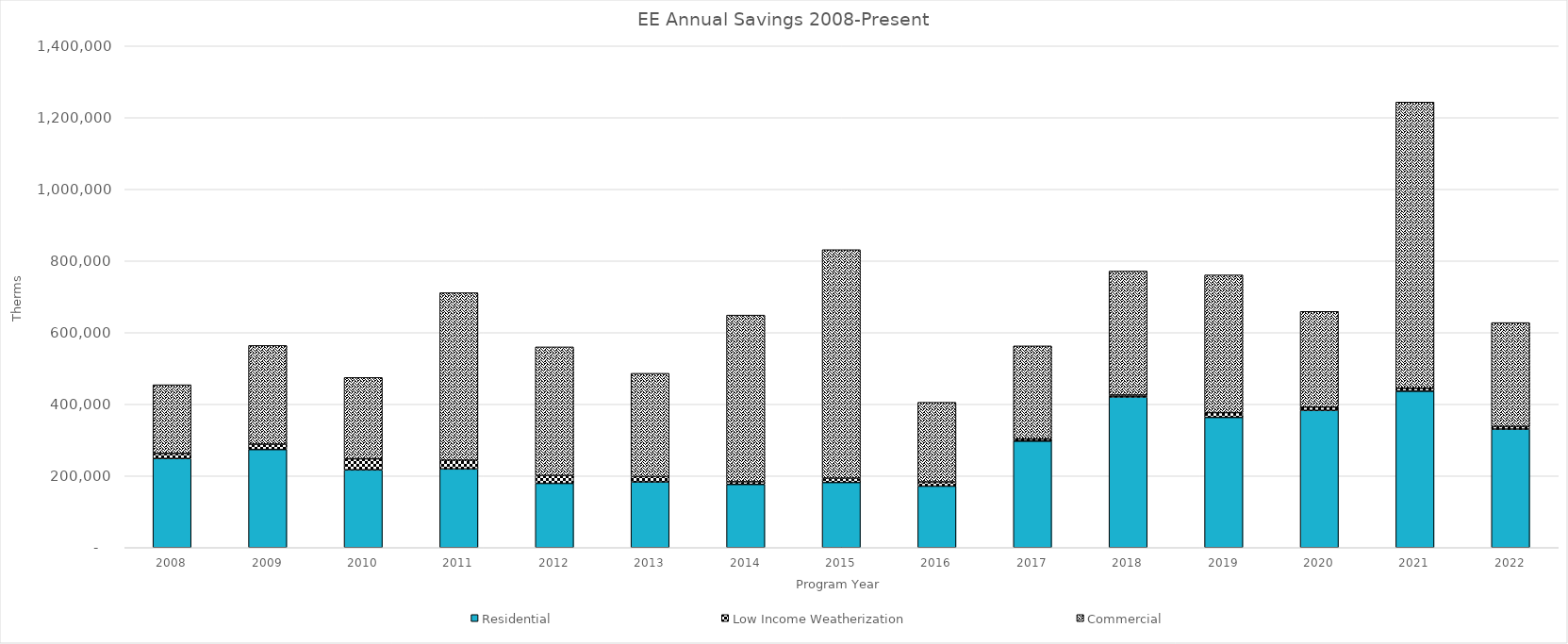
| Category | Residential | Low Income Weatherization | Commercial |
|---|---|---|---|
| 2008.0 | 248658 | 13985 | 191837 |
| 2009.0 | 273833 | 14733 | 275604 |
| 2010.0 | 216999 | 30809 | 227017 |
| 2011.0 | 219596 | 24130 | 467657 |
| 2012.0 | 179330 | 21824 | 359003 |
| 2013.0 | 183352 | 14960 | 288079 |
| 2014.0 | 176439 | 7338 | 465176 |
| 2015.0 | 181847 | 11724 | 637930 |
| 2016.0 | 171620 | 11743 | 222194 |
| 2017.0 | 297216 | 5564 | 260176 |
| 2018.0 | 420639 | 5181 | 345999 |
| 2019.0 | 363364 | 13416 | 384176 |
| 2020.0 | 383018 | 9213 | 266945 |
| 2021.0 | 436553 | 8076 | 798874 |
| 2022.0 | 330767.88 | 7254.19 | 289919.12 |